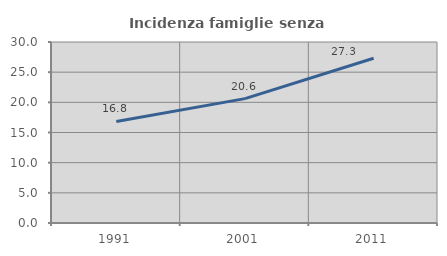
| Category | Incidenza famiglie senza nuclei |
|---|---|
| 1991.0 | 16.838 |
| 2001.0 | 20.611 |
| 2011.0 | 27.309 |